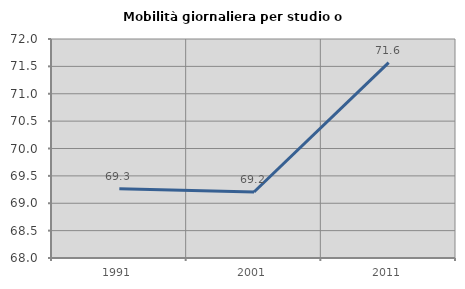
| Category | Mobilità giornaliera per studio o lavoro |
|---|---|
| 1991.0 | 69.267 |
| 2001.0 | 69.205 |
| 2011.0 | 71.567 |